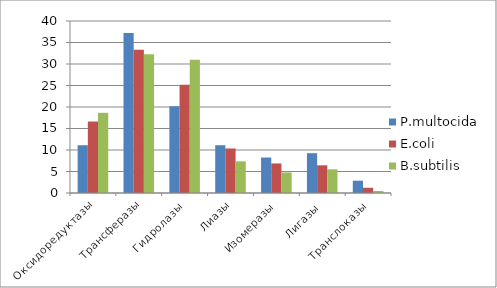
| Category | P.multocida | E.coli | B.subtilis |
|---|---|---|---|
| Оксидоредуктазы | 11.111 | 16.623 | 18.646 |
| Трансферазы | 37.205 | 33.333 | 32.25 |
| Гидролазы | 20.202 | 25.152 | 30.989 |
| Лиазы | 11.111 | 10.357 | 7.366 |
| Изомеразы | 8.249 | 6.876 | 4.778 |
| Лигазы | 9.259 | 6.44 | 5.508 |
| Транслоказы | 2.862 | 1.218 | 0.464 |